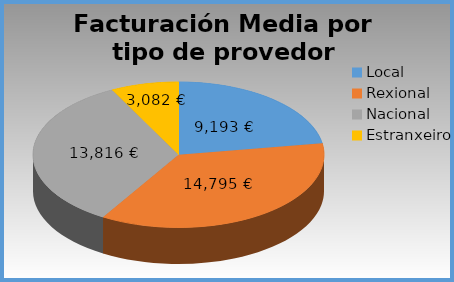
| Category | Facturación Media por tipo de provedor |
|---|---|
| Local | 9192.806 |
| Rexional | 14795.208 |
| Nacional | 13816.233 |
| Estranxeiro | 3081.747 |